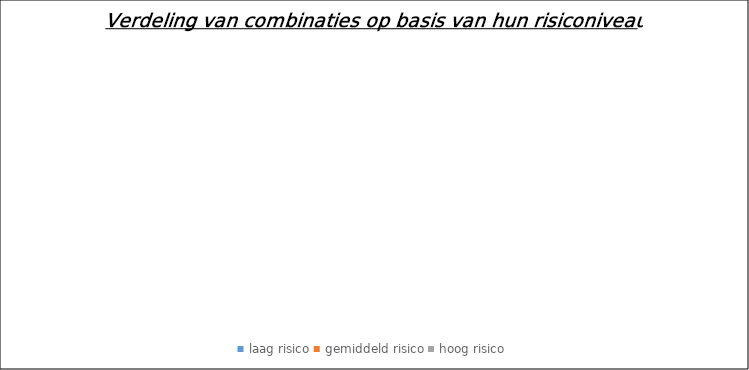
| Category | Series 0 |
|---|---|
| laag risico | 0 |
| gemiddeld risico | 0 |
| hoog risico | 0 |